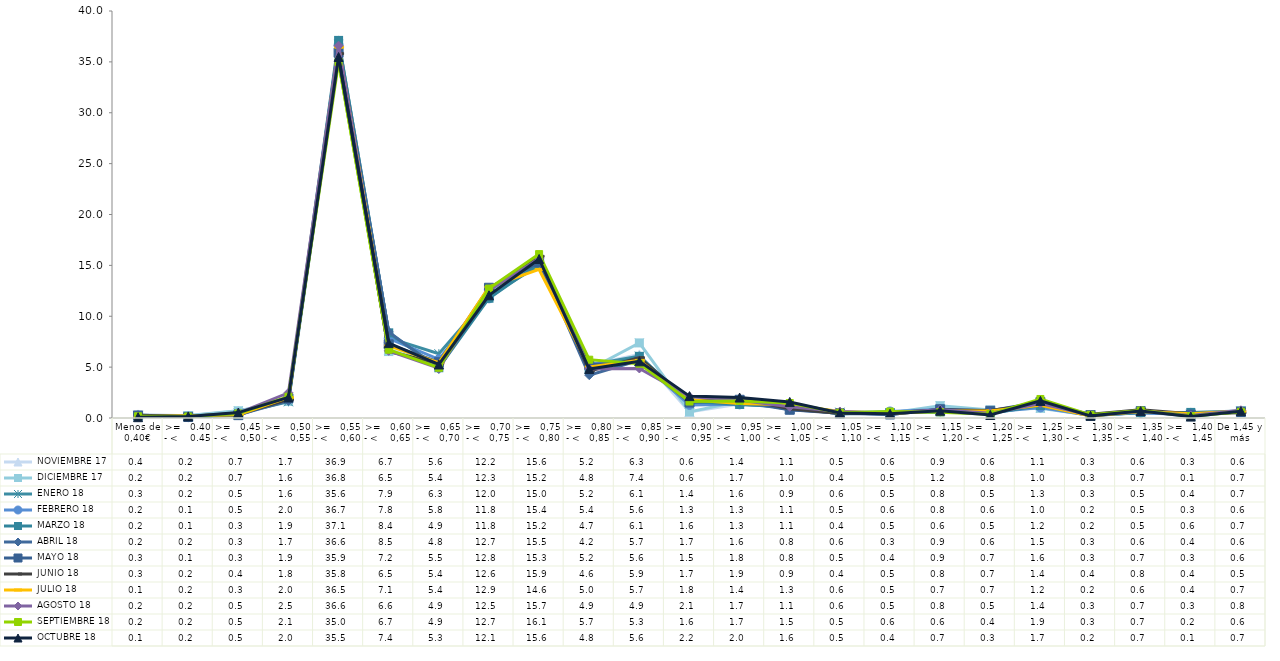
| Category |  NOVIEMBRE 17 |  DICIEMBRE 17 |  ENERO 18 |  FEBRERO 18 |  MARZO 18 |  ABRIL 18 |  MAYO 18 |  JUNIO 18 |  JULIO 18 |  AGOSTO 18 |  SEPTIEMBRE 18 |  OCTUBRE 18 |
|---|---|---|---|---|---|---|---|---|---|---|---|---|
| Menos de 0,40€ | 0.35 | 0.16 | 0.27 | 0.23 | 0.24 | 0.2 | 0.25 | 0.28 | 0.12 | 0.15 | 0.17 | 0.08 |
| >=   0.40 - <    0.45 | 0.21 | 0.24 | 0.17 | 0.08 | 0.1 | 0.16 | 0.11 | 0.17 | 0.22 | 0.15 | 0.15 | 0.15 |
| >=   0,45 - <    0,50 | 0.7 | 0.71 | 0.47 | 0.47 | 0.33 | 0.32 | 0.28 | 0.4 | 0.33 | 0.47 | 0.45 | 0.53 |
| >=   0,50 - <    0,55 | 1.68 | 1.63 | 1.59 | 1.95 | 1.9 | 1.69 | 1.94 | 1.81 | 2.02 | 2.48 | 2.09 | 2.02 |
| >=   0,55 - <    0,60 | 36.88 | 36.78 | 35.62 | 36.65 | 37.11 | 36.55 | 35.9 | 35.81 | 36.45 | 36.59 | 34.99 | 35.48 |
| >=   0,60 - <    0,65 | 6.69 | 6.53 | 7.87 | 7.82 | 8.37 | 8.46 | 7.24 | 6.54 | 7.09 | 6.6 | 6.71 | 7.36 |
| >=   0,65 - <   0,70 | 5.56 | 5.41 | 6.32 | 5.77 | 4.94 | 4.82 | 5.48 | 5.37 | 5.43 | 4.89 | 4.94 | 5.26 |
| >=   0,70 - <   0,75 | 12.24 | 12.31 | 12 | 11.76 | 11.77 | 12.66 | 12.8 | 12.63 | 12.87 | 12.53 | 12.72 | 12.06 |
| >=   0,75 - <   0,80 | 15.56 | 15.2 | 14.99 | 15.39 | 15.19 | 15.48 | 15.29 | 15.89 | 14.6 | 15.68 | 16.11 | 15.63 |
| >=   0,80 - <   0,85 | 5.19 | 4.77 | 5.21 | 5.36 | 4.73 | 4.21 | 5.24 | 4.61 | 5.02 | 4.85 | 5.73 | 4.81 |
| >=   0,85 - <   0,90 | 6.25 | 7.38 | 6.08 | 5.62 | 6.06 | 5.68 | 5.56 | 5.93 | 5.66 | 4.87 | 5.34 | 5.57 |
| >=   0,90 - <    0,95 | 0.6 | 0.6 | 1.37 | 1.29 | 1.62 | 1.67 | 1.52 | 1.71 | 1.79 | 2.1 | 1.62 | 2.15 |
| >=   0,95 - <   1,00 | 1.38 | 1.65 | 1.56 | 1.34 | 1.33 | 1.6 | 1.79 | 1.92 | 1.43 | 1.74 | 1.68 | 2.01 |
| >=   1,00 - <   1,05 | 1.09 | 0.95 | 0.9 | 1.06 | 1.09 | 0.82 | 0.81 | 0.91 | 1.3 | 1.1 | 1.47 | 1.58 |
| >=   1,05 - <    1,10 | 0.48 | 0.44 | 0.57 | 0.46 | 0.4 | 0.55 | 0.46 | 0.44 | 0.63 | 0.64 | 0.52 | 0.5 |
| >=   1,10 - <   1,15 | 0.56 | 0.49 | 0.51 | 0.64 | 0.52 | 0.34 | 0.35 | 0.54 | 0.45 | 0.48 | 0.64 | 0.42 |
| >=   1,15 - <    1,20 | 0.91 | 1.21 | 0.8 | 0.83 | 0.6 | 0.85 | 0.86 | 0.78 | 0.7 | 0.82 | 0.57 | 0.71 |
| >=   1,20 - <    1,25 | 0.64 | 0.79 | 0.52 | 0.57 | 0.45 | 0.55 | 0.71 | 0.73 | 0.69 | 0.46 | 0.38 | 0.3 |
| >=   1,25 - <    1,30 | 1.14 | 0.95 | 1.3 | 1.04 | 1.23 | 1.47 | 1.56 | 1.42 | 1.24 | 1.43 | 1.87 | 1.68 |
| >=   1,30 - <    1,35 | 0.34 | 0.28 | 0.3 | 0.24 | 0.21 | 0.26 | 0.28 | 0.37 | 0.2 | 0.28 | 0.31 | 0.21 |
| >=   1,35 - <    1,40 | 0.6 | 0.74 | 0.51 | 0.51 | 0.54 | 0.64 | 0.67 | 0.81 | 0.63 | 0.68 | 0.73 | 0.68 |
| >=   1,40 - <    1,45 | 0.32 | 0.13 | 0.37 | 0.32 | 0.55 | 0.42 | 0.31 | 0.42 | 0.43 | 0.25 | 0.18 | 0.14 |
| De 1,45 y más | 0.63 | 0.66 | 0.68 | 0.59 | 0.7 | 0.59 | 0.59 | 0.51 | 0.68 | 0.76 | 0.61 | 0.67 |